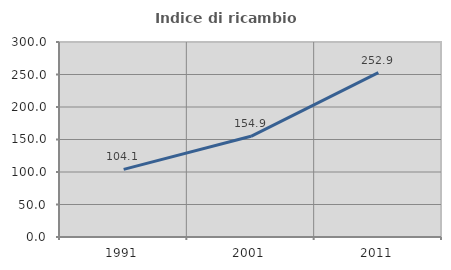
| Category | Indice di ricambio occupazionale  |
|---|---|
| 1991.0 | 104.106 |
| 2001.0 | 154.895 |
| 2011.0 | 252.913 |